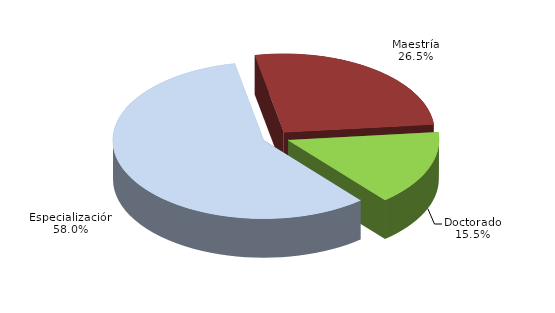
| Category | Series 0 |
|---|---|
| Especialización | 19194 |
| Maestría | 8753 |
| Doctorado | 5129 |